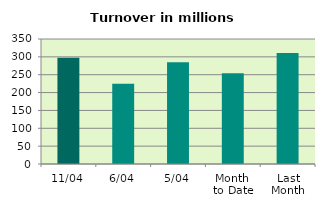
| Category | Series 0 |
|---|---|
| 11/04 | 297.827 |
| 6/04 | 224.829 |
| 5/04 | 285.227 |
| Month 
to Date | 254.224 |
| Last
Month | 310.688 |